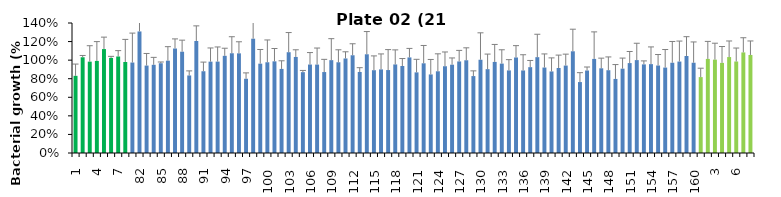
| Category | 21 h % |
|---|---|
| 1.0 | 0.831 |
| 2.0 | 1.031 |
| 3.0 | 0.984 |
| 4.0 | 0.992 |
| 5.0 | 1.119 |
| 6.0 | 1.024 |
| 7.0 | 1.039 |
| 8.0 | 0.98 |
| 81.0 | 0.974 |
| 82.0 | 1.309 |
| 83.0 | 0.942 |
| 84.0 | 0.95 |
| 85.0 | 0.967 |
| 86.0 | 0.994 |
| 87.0 | 1.125 |
| 88.0 | 1.091 |
| 89.0 | 0.835 |
| 90.0 | 1.206 |
| 91.0 | 0.881 |
| 92.0 | 0.984 |
| 93.0 | 0.984 |
| 94.0 | 1.047 |
| 95.0 | 1.074 |
| 96.0 | 1.073 |
| 97.0 | 0.8 |
| 98.0 | 1.231 |
| 99.0 | 0.962 |
| 100.0 | 0.977 |
| 101.0 | 0.987 |
| 102.0 | 0.906 |
| 103.0 | 1.085 |
| 104.0 | 1.034 |
| 105.0 | 0.871 |
| 106.0 | 0.953 |
| 107.0 | 0.952 |
| 108.0 | 0.872 |
| 109.0 | 1 |
| 110.0 | 0.977 |
| 111.0 | 1.018 |
| 112.0 | 1.053 |
| 113.0 | 0.873 |
| 114.0 | 1.063 |
| 115.0 | 0.892 |
| 116.0 | 0.901 |
| 117.0 | 0.893 |
| 118.0 | 0.954 |
| 119.0 | 0.937 |
| 120.0 | 1.029 |
| 121.0 | 0.868 |
| 122.0 | 0.966 |
| 123.0 | 0.846 |
| 124.0 | 0.88 |
| 125.0 | 0.934 |
| 126.0 | 0.951 |
| 127.0 | 0.986 |
| 128.0 | 0.999 |
| 129.0 | 0.828 |
| 130.0 | 1.004 |
| 131.0 | 0.903 |
| 132.0 | 0.981 |
| 133.0 | 0.963 |
| 134.0 | 0.889 |
| 135.0 | 1.029 |
| 136.0 | 0.889 |
| 137.0 | 0.924 |
| 138.0 | 1.032 |
| 139.0 | 0.921 |
| 140.0 | 0.878 |
| 141.0 | 0.916 |
| 142.0 | 0.942 |
| 143.0 | 1.095 |
| 144.0 | 0.764 |
| 145.0 | 0.888 |
| 146.0 | 1.013 |
| 147.0 | 0.912 |
| 148.0 | 0.892 |
| 149.0 | 0.798 |
| 150.0 | 0.908 |
| 151.0 | 0.968 |
| 152.0 | 1 |
| 153.0 | 0.954 |
| 154.0 | 0.957 |
| 155.0 | 0.942 |
| 156.0 | 0.92 |
| 157.0 | 0.972 |
| 158.0 | 0.985 |
| 159.0 | 1.045 |
| 160.0 | 0.972 |
| 1.0 | 0.817 |
| 2.0 | 1.013 |
| 3.0 | 1.005 |
| 4.0 | 0.971 |
| 5.0 | 1.033 |
| 6.0 | 0.985 |
| 7.0 | 1.083 |
| 8.0 | 1.056 |